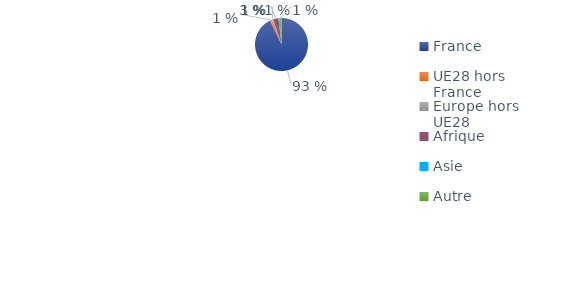
| Category | Series 0 |
|---|---|
| France | 0.929 |
| UE28 hors France | 0.015 |
| Europe hors UE28 | 0.006 |
| Afrique | 0.032 |
| Asie | 0.006 |
| Autre | 0.013 |